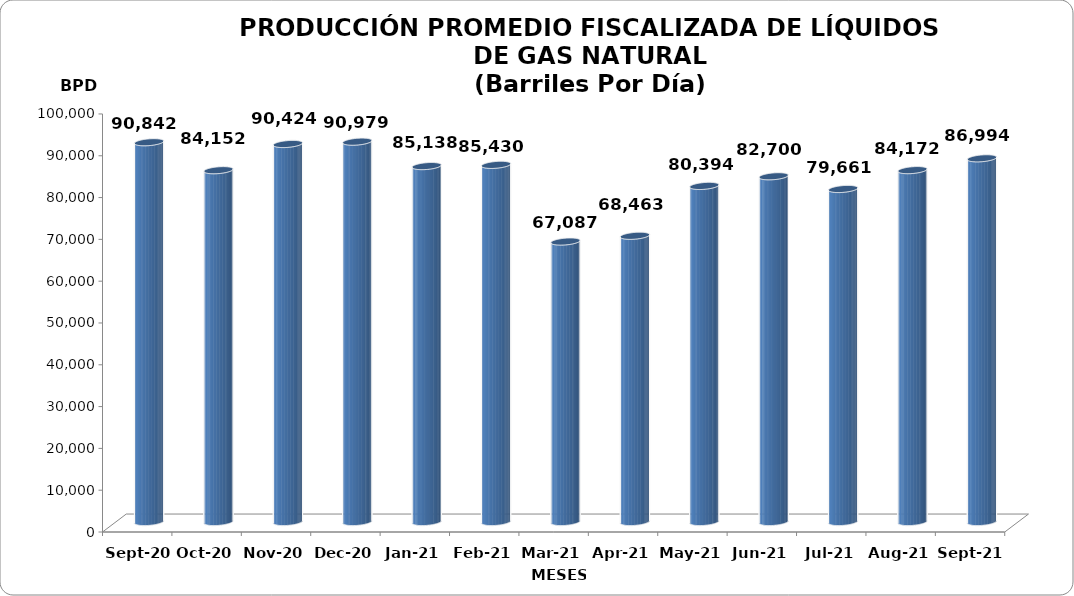
| Category | Series 0 |
|---|---|
| 2020-09-01 | 90842 |
| 2020-10-01 | 84152 |
| 2020-11-01 | 90424 |
| 2020-12-01 | 90979 |
| 2021-01-01 | 85138 |
| 2021-02-01 | 85430 |
| 2021-03-01 | 67087 |
| 2021-04-01 | 68463 |
| 2021-05-01 | 80393.645 |
| 2021-06-01 | 82699.833 |
| 2021-07-01 | 79661.29 |
| 2021-08-01 | 84171.548 |
| 2021-09-01 | 86994 |